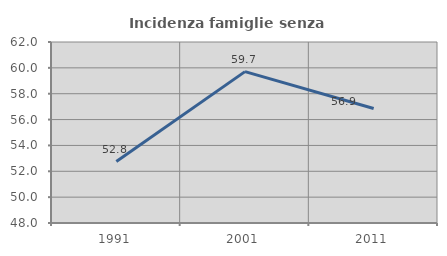
| Category | Incidenza famiglie senza nuclei |
|---|---|
| 1991.0 | 52.751 |
| 2001.0 | 59.71 |
| 2011.0 | 56.857 |